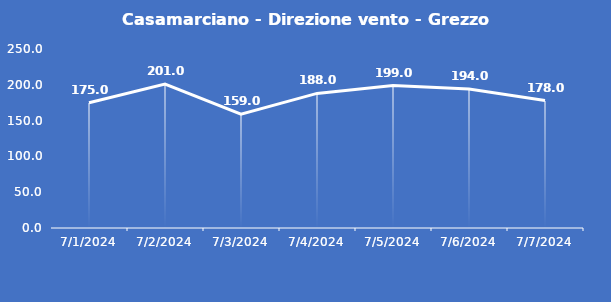
| Category | Casamarciano - Direzione vento - Grezzo (°N) |
|---|---|
| 7/1/24 | 175 |
| 7/2/24 | 201 |
| 7/3/24 | 159 |
| 7/4/24 | 188 |
| 7/5/24 | 199 |
| 7/6/24 | 194 |
| 7/7/24 | 178 |